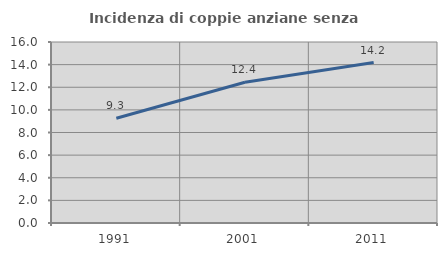
| Category | Incidenza di coppie anziane senza figli  |
|---|---|
| 1991.0 | 9.261 |
| 2001.0 | 12.445 |
| 2011.0 | 14.187 |